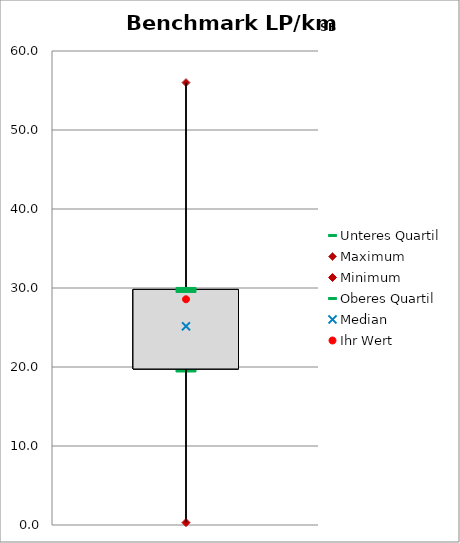
| Category | Unteres Quartil | Maximum | Minimum | Oberes Quartil |
|---|---|---|---|---|
| LP/kmSB | 19.75 | 56 | 0.306 | 29.817 |